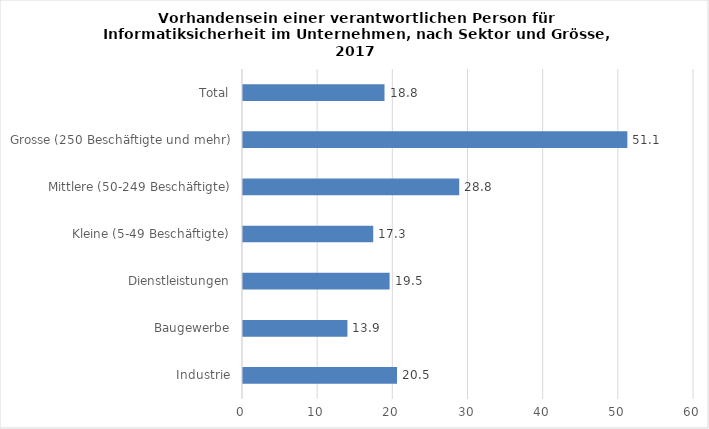
| Category | Series 0 |
|---|---|
| Industrie | 20.495 |
| Baugewerbe | 13.895 |
| Dienstleistungen | 19.502 |
| Kleine (5-49 Beschäftigte) | 17.323 |
| Mittlere (50-249 Beschäftigte) | 28.767 |
| Grosse (250 Beschäftigte und mehr) | 51.134 |
| Total | 18.826 |